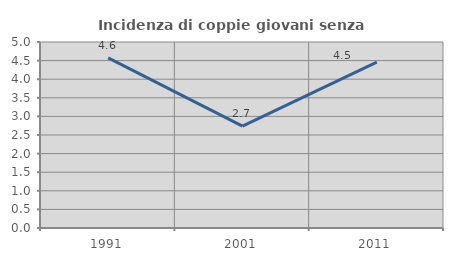
| Category | Incidenza di coppie giovani senza figli |
|---|---|
| 1991.0 | 4.574 |
| 2001.0 | 2.738 |
| 2011.0 | 4.461 |